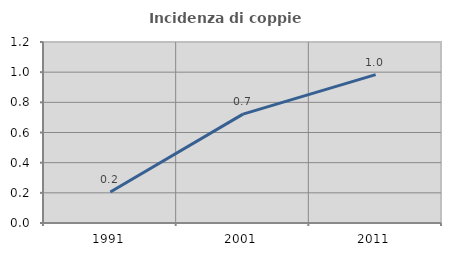
| Category | Incidenza di coppie miste |
|---|---|
| 1991.0 | 0.206 |
| 2001.0 | 0.722 |
| 2011.0 | 0.983 |